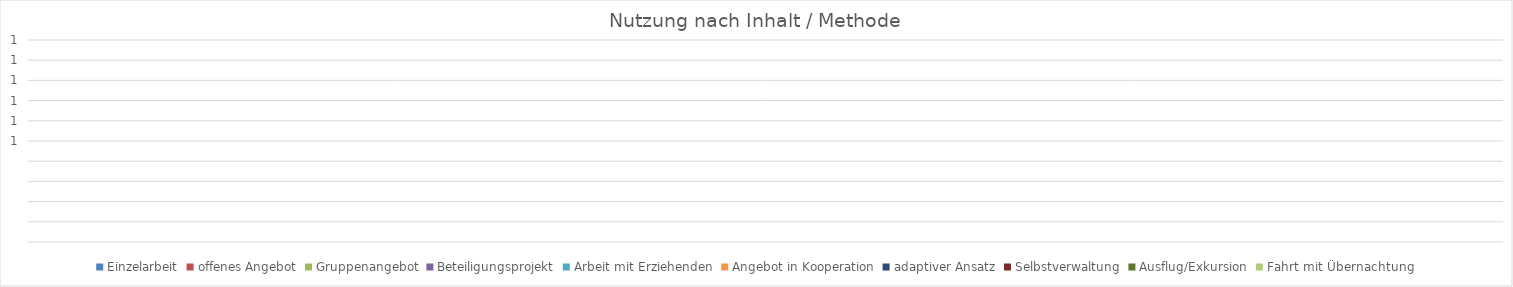
| Category | Einzelarbeit | offenes Angebot | Gruppenangebot | Beteiligungsprojekt | Arbeit mit Erziehenden | Angebot in Kooperation | adaptiver Ansatz | Selbstverwaltung | Ausflug/Exkursion | Fahrt mit Übernachtung |
|---|---|---|---|---|---|---|---|---|---|---|
| 0 | 0 | 0 | 0 | 0 | 0 | 0 | 0 | 0 | 0 | 0 |